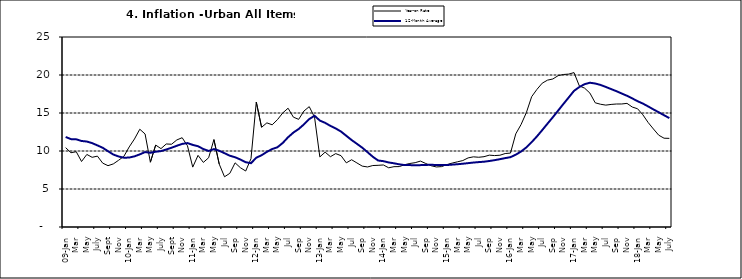
| Category | Year-on Rate | 12-Month Average |
|---|---|---|
| 09-Jan | 10.439 | 11.844 |
| Feb | 9.772 | 11.562 |
| Mar | 9.907 | 11.538 |
| Apr | 8.618 | 11.319 |
| May | 9.547 | 11.246 |
| June | 9.17 | 11.039 |
| July | 9.325 | 10.738 |
| Aug | 8.401 | 10.424 |
| Sept | 8.07 | 9.973 |
| Oct | 8.3 | 9.535 |
| Nov | 8.781 | 9.278 |
| Dec | 9.298 | 9.117 |
| 10-Jan | 10.534 | 9.136 |
| Feb | 11.584 | 9.297 |
| Mar | 12.864 | 9.555 |
| Apr | 12.24 | 9.859 |
| May | 8.524 | 9.769 |
| June | 10.781 | 9.904 |
| July | 10.313 | 9.987 |
| Aug | 10.924 | 10.197 |
| Sept | 10.891 | 10.43 |
| Oct | 11.457 | 10.689 |
| Nov | 11.748 | 10.932 |
| Dec | 10.699 | 11.042 |
| 11-Jan | 7.878 | 10.806 |
| Feb | 9.426 | 10.623 |
| Mar | 8.498 | 10.26 |
| Apr | 9.11 | 10.005 |
| May | 11.5 | 10.249 |
| Jun | 8.278 | 10.034 |
| Jul | 6.608 | 9.711 |
| Aug | 7.061 | 9.38 |
| Sep | 8.443 | 9.178 |
| Oct | 7.802 | 8.88 |
| Nov | 7.365 | 8.525 |
| Dec | 8.993 | 8.395 |
| 12-Jan | 16.445 | 9.119 |
| Feb | 13.123 | 9.443 |
| Mar | 13.701 | 9.889 |
| Apr | 13.447 | 10.259 |
| May | 14.127 | 10.496 |
| Jun | 15.012 | 11.062 |
| Jul | 15.63 | 11.81 |
| Aug | 14.456 | 12.422 |
| Sep | 14.162 | 12.893 |
| Oct | 15.26 | 13.506 |
| Nov | 15.836 | 14.199 |
| Dec | 14.459 | 14.637 |
| 13-Jan | 9.22 | 14.006 |
| Feb | 9.85 | 13.703 |
| Mar | 9.253 | 13.302 |
| Apr | 9.657 | 12.966 |
| May | 9.385 | 12.557 |
| Jun | 8.441 | 11.999 |
| Jul | 8.849 | 11.443 |
| Aug | 8.431 | 10.946 |
| Sep | 8.013 | 10.44 |
| Oct | 7.9 | 9.849 |
| Nov | 8.086 | 9.245 |
| Dec | 8.117 | 8.75 |
| 14-Jan | 8.164 | 8.662 |
| Feb | 7.791 | 8.493 |
| Mar | 7.937 | 8.384 |
| Apr | 7.947 | 8.246 |
| May | 8.195 | 8.151 |
| Jun | 8.358 | 8.146 |
| Jul | 8.464 | 8.118 |
| Aug | 8.673 | 8.141 |
| Sep | 8.357 | 8.17 |
| Oct | 8.064 | 8.182 |
| Nov | 7.902 | 8.165 |
| Dec | 7.948 | 8.151 |
| 15-Jan | 8.211 | 8.155 |
| Feb | 8.412 | 8.206 |
| Mar | 8.579 | 8.26 |
| Apr | 8.742 | 8.326 |
| May | 9.092 | 8.403 |
| Jun | 9.232 | 8.478 |
| Jul | 9.177 | 8.54 |
| Aug | 9.25 | 8.591 |
| Sep | 9.455 | 8.684 |
| Oct | 9.398 | 8.795 |
| Nov | 9.442 | 8.922 |
| Dec | 9.665 | 9.064 |
| 16-Jan | 9.728 | 9.19 |
| Feb | 12.254 | 9.516 |
| Mar | 13.485 | 9.935 |
| Apr | 15.052 | 10.474 |
| May | 17.148 | 11.165 |
| Jun | 18.111 | 11.925 |
| Jul | 18.927 | 12.754 |
| Aug | 19.325 | 13.605 |
| Sep | 19.476 | 14.444 |
| Oct | 19.914 | 15.318 |
| Nov | 20.067 | 16.193 |
| Dec | 20.118 | 17.05 |
| 17-Jan | 20.315 | 17.914 |
| Feb | 18.569 | 18.418 |
| Mar | 18.27 | 18.794 |
| Apr | 17.621 | 18.982 |
| May | 16.343 | 18.883 |
| Jun | 16.153 | 18.692 |
| Jul | 16.038 | 18.43 |
| Aug | 16.128 | 18.151 |
| Sep | 16.183 | 17.872 |
| Oct | 16.187 | 17.567 |
| Nov | 16.267 | 17.264 |
| Dec | 15.785 | 16.921 |
| 18-Jan | 15.559 | 16.55 |
| Feb | 14.763 | 16.241 |
| Mar | 13.748 | 15.866 |
| Apr | 12.893 | 15.468 |
| May | 12.077 | 15.096 |
| June | 11.683 | 14.706 |
| July | 11.661 | 14.329 |